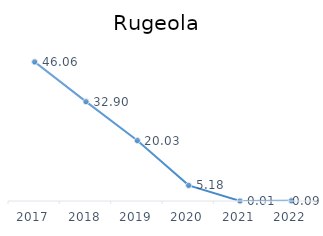
| Category | Series 0 |
|---|---|
| 2017.0 | 46.06 |
| 2018.0 | 32.9 |
| 2019.0 | 20.03 |
| 2020.0 | 5.18 |
| 2021.0 | 0.01 |
| 2022.0 | 0.09 |